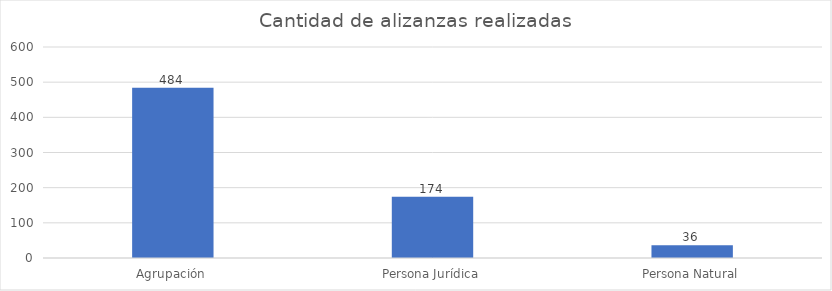
| Category | Cantidad de alizanzas realizadas |
|---|---|
| Agrupación | 484 |
| Persona Jurídica | 174 |
| Persona Natural | 36 |